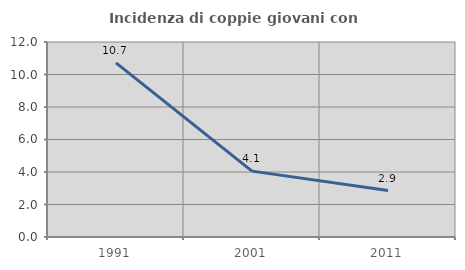
| Category | Incidenza di coppie giovani con figli |
|---|---|
| 1991.0 | 10.714 |
| 2001.0 | 4.054 |
| 2011.0 | 2.857 |